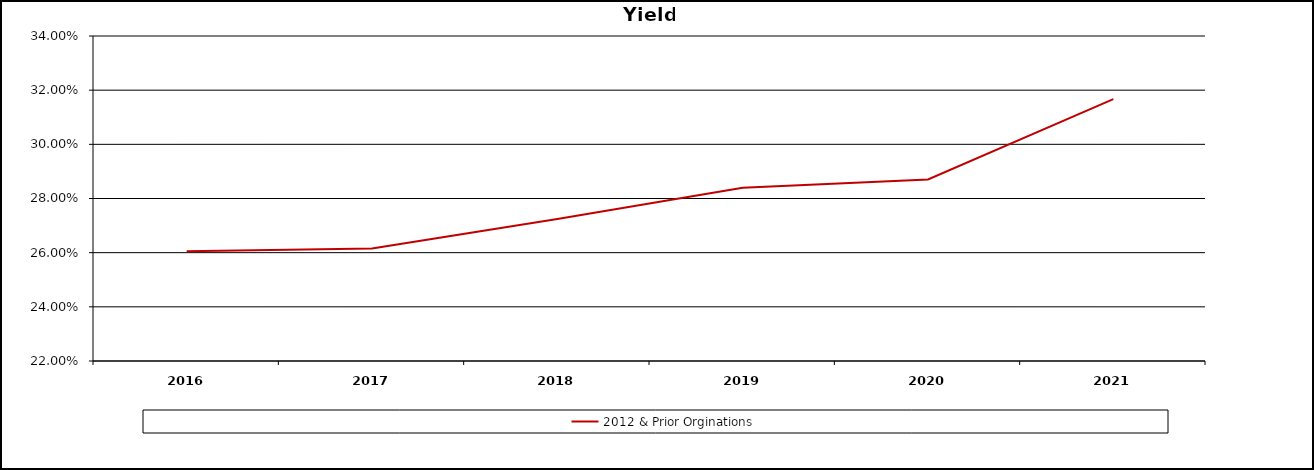
| Category | 2012 & Prior Orginations  |
|---|---|
| 2016.0 | 0.26 |
| 2017.0 | 0.262 |
| 2018.0 | 0.272 |
| 2019.0 | 0.284 |
| 2020.0 | 0.287 |
| 2021.0 | 0.317 |